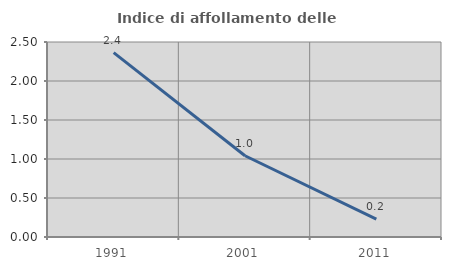
| Category | Indice di affollamento delle abitazioni  |
|---|---|
| 1991.0 | 2.363 |
| 2001.0 | 1.042 |
| 2011.0 | 0.229 |